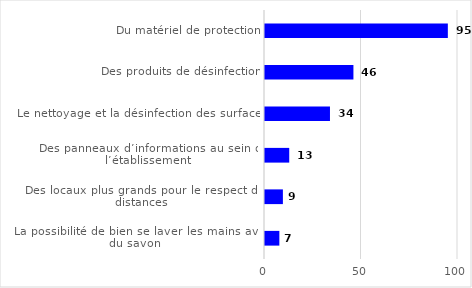
| Category | Series 0 |
|---|---|
| Du matériel de protection | 94.737 |
| Des produits de désinfection | 45.815 |
| Le nettoyage et la désinfection des surfaces | 33.663 |
| Des panneaux d’informations au sein de l’établissement  | 12.556 |
| Des locaux plus grands pour le respect des distances | 9.271 |
| La possibilité de bien se laver les mains avec du savon  | 7.435 |